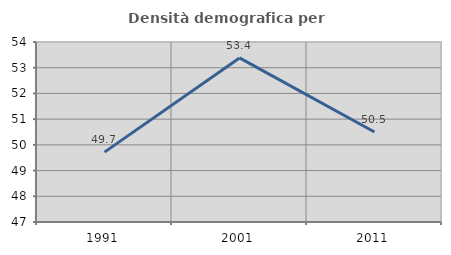
| Category | Densità demografica |
|---|---|
| 1991.0 | 49.718 |
| 2001.0 | 53.38 |
| 2011.0 | 50.502 |